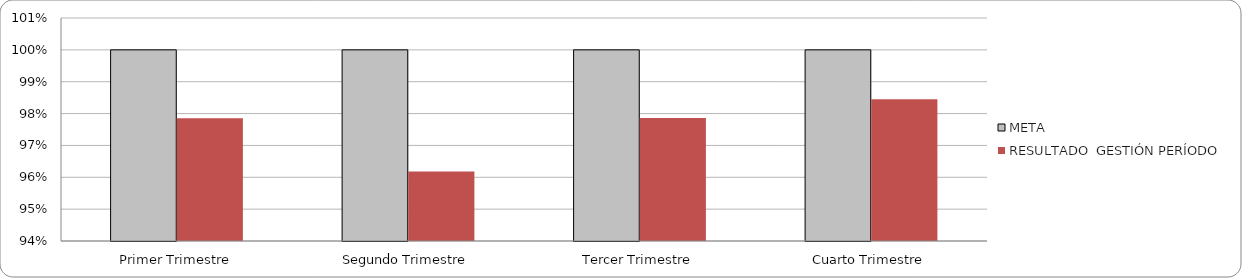
| Category | META | RESULTADO  GESTIÓN PERÍODO |
|---|---|---|
| Primer Trimestre | 1 | 0.978 |
| Segundo Trimestre | 1 | 0.962 |
| Tercer Trimestre | 1 | 0.979 |
| Cuarto Trimestre | 1 | 0.984 |